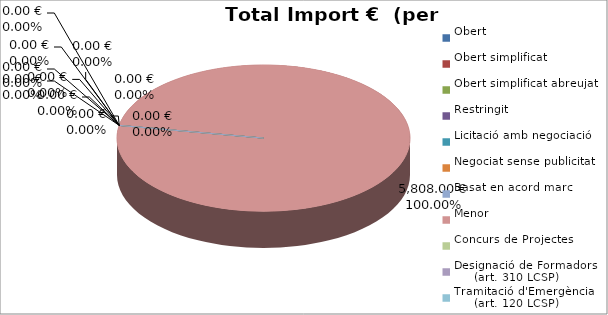
| Category | Total preu
(amb IVA) |
|---|---|
| Obert | 0 |
| Obert simplificat | 0 |
| Obert simplificat abreujat | 0 |
| Restringit | 0 |
| Licitació amb negociació | 0 |
| Negociat sense publicitat | 0 |
| Basat en acord marc | 0 |
| Menor | 5808 |
| Concurs de Projectes | 0 |
| Designació de Formadors
     (art. 310 LCSP) | 0 |
| Tramitació d'Emergència
     (art. 120 LCSP) | 0 |